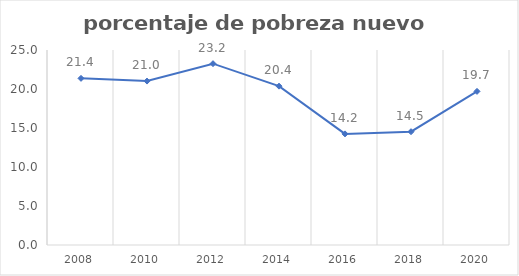
| Category | Series 0 |
|---|---|
| 2008.0 | 21.365 |
| 2010.0 | 21.018 |
| 2012.0 | 23.247 |
| 2014.0 | 20.366 |
| 2016.0 | 14.246 |
| 2018.0 | 14.527 |
| 2020.0 | 19.697 |